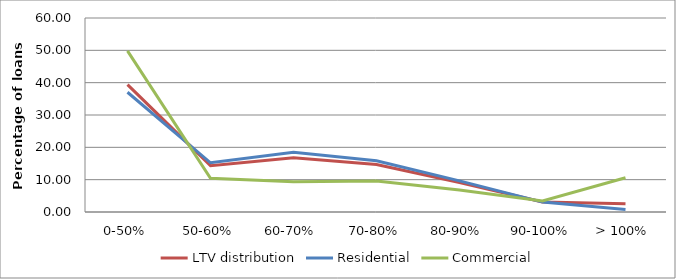
| Category | LTV distribution | Residential | Commercial |
|---|---|---|---|
| 0-50% | 39.393 | 37.037 | 49.811 |
| 50-60% | 14.34 | 15.22 | 10.449 |
| 60-70% | 16.784 | 18.462 | 9.365 |
| 70-80% | 14.669 | 15.825 | 9.554 |
| 80-90% | 9.1 | 9.62 | 6.797 |
| 90-100% | 3.129 | 3.058 | 3.444 |
| > 100% | 2.585 | 0.778 | 10.58 |